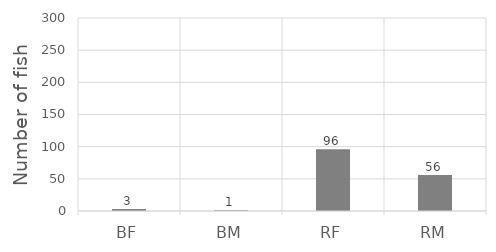
| Category | Series 0 |
|---|---|
| BF | 3 |
| BM | 1 |
| RF | 96 |
| RM | 56 |